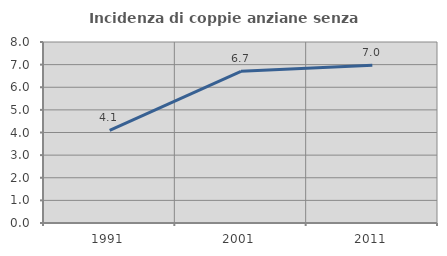
| Category | Incidenza di coppie anziane senza figli  |
|---|---|
| 1991.0 | 4.091 |
| 2001.0 | 6.706 |
| 2011.0 | 6.967 |